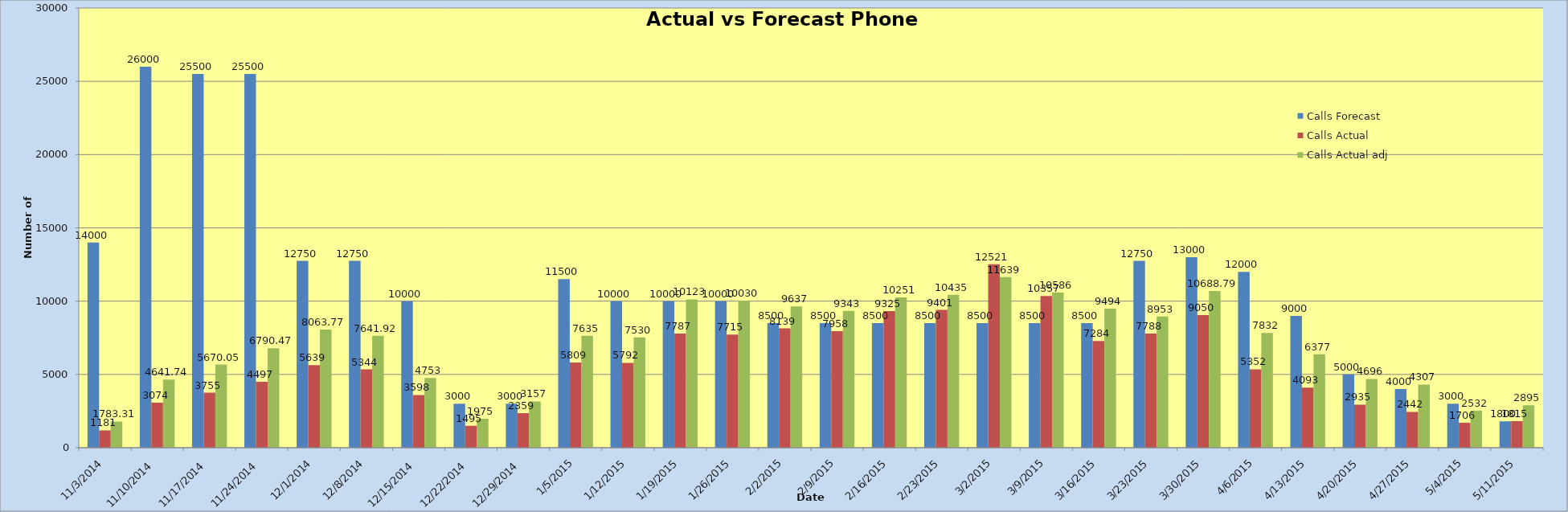
| Category | Calls Forecast | Calls Actual | Calls Actual adj |
|---|---|---|---|
| 11/3/14 | 14000 | 1181 | 1783.31 |
| 11/10/14 | 26000 | 3074 | 4641.74 |
| 11/17/14 | 25500 | 3755 | 5670.05 |
| 11/24/14 | 25500 | 4497 | 6790.47 |
| 12/1/14 | 12750 | 5639 | 8063.77 |
| 12/8/14 | 12750 | 5344 | 7641.92 |
| 12/15/14 | 10000 | 3598 | 4753 |
| 12/22/14 | 3000 | 1495 | 1975 |
| 12/29/14 | 3000 | 2359 | 3157 |
| 1/5/15 | 11500 | 5809 | 7635 |
| 1/12/15 | 10000 | 5792 | 7530 |
| 1/19/15 | 10000 | 7787 | 10123 |
| 1/26/15 | 10000 | 7715 | 10030 |
| 2/2/15 | 8500 | 8139 | 9637 |
| 2/9/15 | 8500 | 7958 | 9343 |
| 2/16/15 | 8500 | 9325 | 10251 |
| 2/23/15 | 8500 | 9401 | 10435 |
| 3/2/15 | 8500 | 12521 | 11639 |
| 3/9/15 | 8500 | 10357 | 10586 |
| 3/16/15 | 8500 | 7284 | 9494 |
| 3/23/15 | 12750 | 7788 | 8953 |
| 3/30/15 | 13000 | 9050 | 10688.79 |
| 4/6/15 | 12000 | 5352 | 7832 |
| 4/13/15 | 9000 | 4093 | 6377 |
| 4/20/15 | 5000 | 2935 | 4696 |
| 4/27/15 | 4000 | 2442 | 4307 |
| 5/4/15 | 3000 | 1706 | 2532 |
| 5/11/15 | 1800 | 1815 | 2895 |